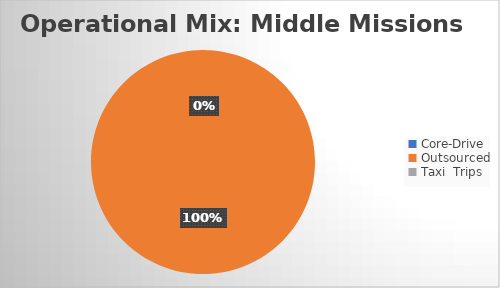
| Category | Series 0 |
|---|---|
| Core-Drive | 0 |
| Outsourced | 13 |
| Taxi  Trips | 0 |